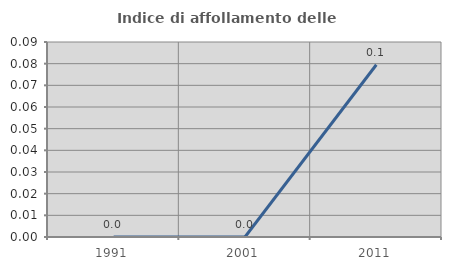
| Category | Indice di affollamento delle abitazioni  |
|---|---|
| 1991.0 | 0 |
| 2001.0 | 0 |
| 2011.0 | 0.079 |